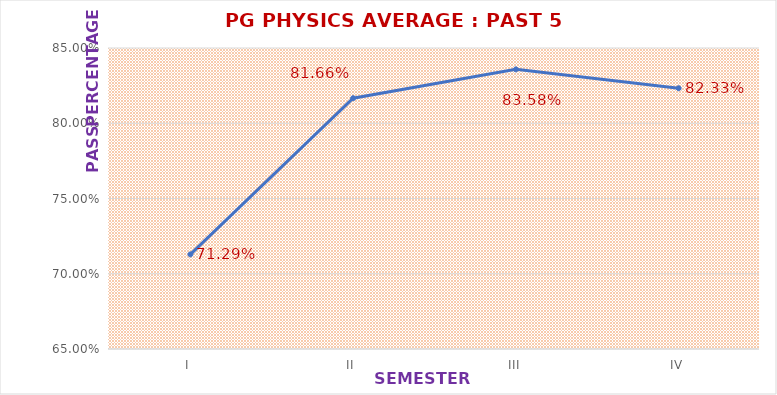
| Category | PG PHYSICS |
|---|---|
| I | 0.713 |
| II | 0.817 |
| III | 0.836 |
| IV | 0.823 |